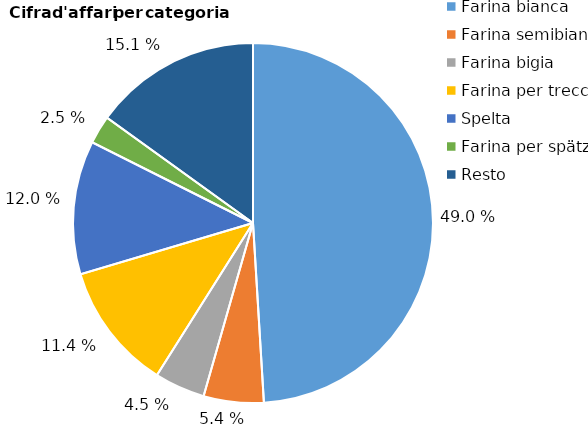
| Category | Series 0 |
|---|---|
| Farina bianca | 33.994 |
| Farina semibianca | 3.735 |
| Farina bigia | 3.149 |
| Farina per treccia | 7.927 |
| Spelta | 8.323 |
| Farina per spätzli | 1.759 |
| Resto | 10.439 |